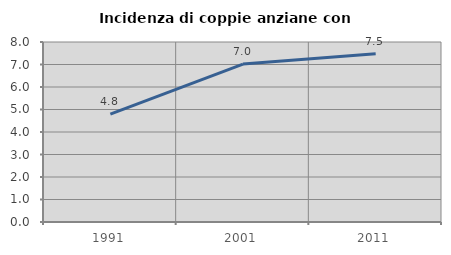
| Category | Incidenza di coppie anziane con figli |
|---|---|
| 1991.0 | 4.79 |
| 2001.0 | 7.02 |
| 2011.0 | 7.477 |